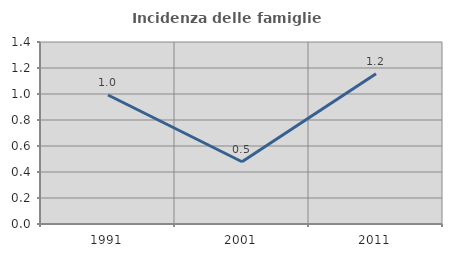
| Category | Incidenza delle famiglie numerose |
|---|---|
| 1991.0 | 0.992 |
| 2001.0 | 0.479 |
| 2011.0 | 1.156 |